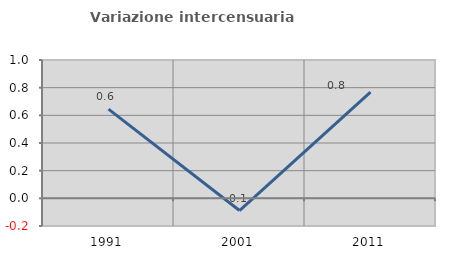
| Category | Variazione intercensuaria annua |
|---|---|
| 1991.0 | 0.645 |
| 2001.0 | -0.088 |
| 2011.0 | 0.768 |